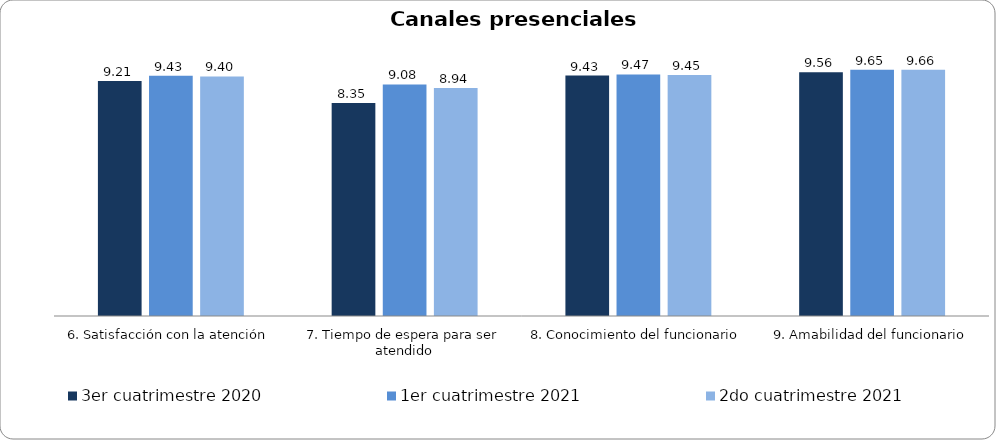
| Category | 3er cuatrimestre 2020 | Septiembre - Octubre 2018 | 1er cuatrimestre 2021 | Noviembre - Diciembre 2018 | 1er cuatrimestre 2019 | 2do cuatrimestre 2019 | 2do cuatrimestre 2021 |
|---|---|---|---|---|---|---|---|
| 6. Satisfacción con la atención | 9.215 |  | 9.425 |  |  |  | 9.396 |
| 7. Tiempo de espera para ser atendido | 8.348 |  | 9.079 |  |  |  | 8.938 |
| 8. Conocimiento del funcionario | 9.43 |  | 9.472 |  |  |  | 9.448 |
| 9. Amabilidad del funcionario | 9.556 |  | 9.654 |  |  |  | 9.656 |